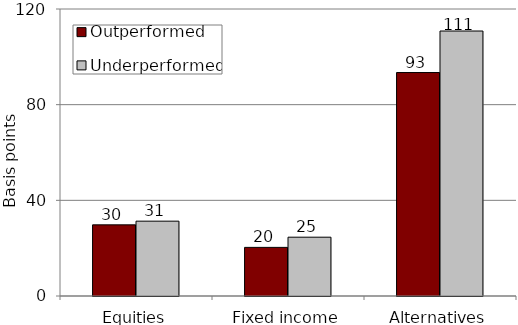
| Category | Outperformed | Underperformed |
|---|---|---|
| Equities | 29.751 | 31.291 |
| Fixed income | 20.329 | 24.589 |
| Alternatives | 93.431 | 110.794 |